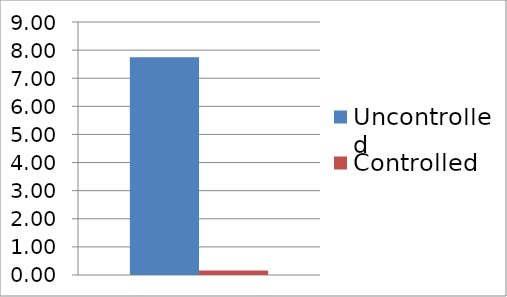
| Category | Uncontrolled | Controlled |
|---|---|---|
| 0 | 7.749 | 0.162 |